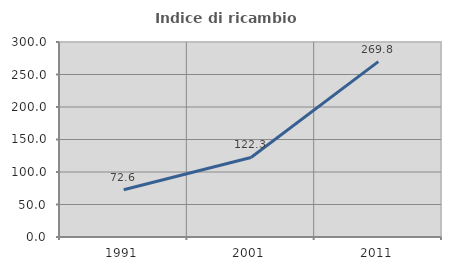
| Category | Indice di ricambio occupazionale  |
|---|---|
| 1991.0 | 72.597 |
| 2001.0 | 122.312 |
| 2011.0 | 269.841 |